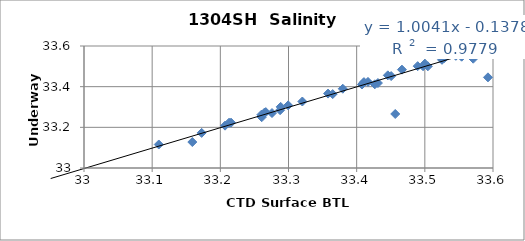
| Category | Series 0 |
|---|---|
| 33.5697 | 33.578 |
| 33.5747 | 33.569 |
| 33.571 | 33.538 |
| 33.5569 | 33.566 |
| 33.576 | 33.588 |
| 33.5303 | 33.549 |
| 33.4895 | 33.501 |
| 33.4457 | 33.456 |
| 33.5611 | 33.566 |
| 33.554 | 33.547 |
| 33.5661 | 33.555 |
| 33.5693 | 33.57 |
| 33.5668 | 33.566 |
| 33.6139 | 33.623 |
| 33.5965 | 33.6 |
| 33.5975 | 33.609 |
| 33.5961 | 33.604 |
| 33.5555 | 33.559 |
| 33.5532 | 33.558 |
| 33.5926 | 33.446 |
| 33.5286 | 33.541 |
| 33.358 | 33.366 |
| 33.4566 | 33.266 |
| 33.2885 | 33.301 |
| 33.3648 | 33.363 |
| 33.5252 | 33.532 |
| 33.4166 | 33.423 |
| 33.3796 | 33.39 |
| 33.4107 | 33.422 |
| 33.2995 | 33.308 |
| 33.2758 | 33.27 |
| 33.4096 | 33.418 |
| 33.5001 | 33.513 |
| 33.5924 | 33.604 |
| 33.6587 | 33.671 |
| 33.6755 | 33.676 |
| 33.6305 | 33.653 |
| 33.7025 | 33.711 |
| 33.7144 | 33.709 |
| 33.7466 | 33.757 |
| 33.9277 | 33.933 |
| 33.7336 | 33.746 |
| 33.5044 | 33.5 |
| 33.4506 | 33.452 |
| 33.2157 | 33.223 |
| 33.4974 | 33.5 |
| 33.4266 | 33.412 |
| 33.265 | 33.273 |
| 33.2667 | 33.275 |
| 33.4664 | 33.484 |
| 33.5455 | 33.552 |
| 33.6939 | 33.701 |
| 33.8268 | 33.829 |
| 33.8655 | 33.868 |
| 33.5943 | 33.609 |
| 33.5943 | 33.604 |
| 33.3203 | 33.327 |
| 33.2607 | 33.25 |
| 33.2601 | 33.262 |
| 33.1097 | 33.116 |
| 33.2128 | 33.223 |
| 33.7446 | 33.748 |
| 33.7442 | 33.752 |
| 33.8667 | 33.871 |
| 33.8132 | 33.819 |
| 33.6279 | 33.631 |
| 33.5533 | 33.586 |
| 33.2877 | 33.284 |
| 32.9511 | 32.952 |
| 33.2069 | 33.208 |
| 33.1726 | 33.173 |
| 33.4078 | 33.411 |
| 33.8272 | 33.827 |
| 33.1589 | 33.128 |
| 33.4312 | 33.418 |
| 33.8686 | 33.848 |